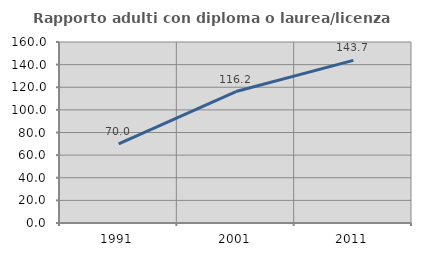
| Category | Rapporto adulti con diploma o laurea/licenza media  |
|---|---|
| 1991.0 | 69.984 |
| 2001.0 | 116.23 |
| 2011.0 | 143.745 |